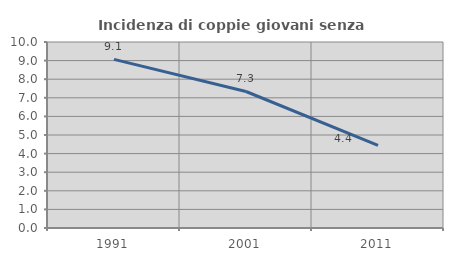
| Category | Incidenza di coppie giovani senza figli |
|---|---|
| 1991.0 | 9.065 |
| 2001.0 | 7.339 |
| 2011.0 | 4.446 |